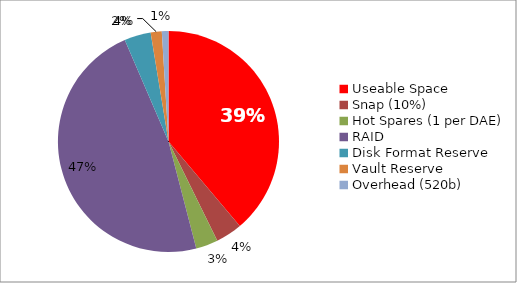
| Category | Series 0 |
|---|---|
| Useable Space | 120 |
| Snap (10%) | 12 |
| Hot Spares (1 per DAE) | 10 |
| RAID | 147 |
| Disk Format Reserve | 12 |
| Vault Reserve | 5 |
| Overhead (520b) | 3 |